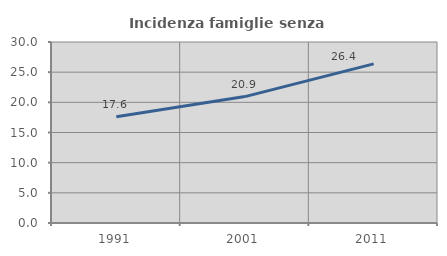
| Category | Incidenza famiglie senza nuclei |
|---|---|
| 1991.0 | 17.611 |
| 2001.0 | 20.95 |
| 2011.0 | 26.377 |